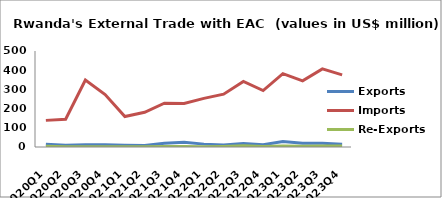
| Category | Exports | Imports | Re-Exports |
|---|---|---|---|
| 2020Q1 | 14.209 | 138.663 | 3.748 |
| 2020Q2 | 8.786 | 144.885 | 1.712 |
| 2020Q3 | 11.767 | 348.723 | 1.141 |
| 2020Q4 | 12.136 | 273.335 | 0.92 |
| 2021Q1 | 9.302 | 158.626 | 0.693 |
| 2021Q2 | 7.396 | 180.858 | 1.076 |
| 2021Q3 | 19.208 | 228.408 | 2.214 |
| 2021Q4 | 24.275 | 227.083 | 3.044 |
| 2022Q1 | 14.976 | 253.288 | 1.717 |
| 2022Q2 | 10.835 | 275.058 | 3.227 |
| 2022Q3 | 18.34 | 341.329 | 6.748 |
| 2022Q4 | 11.691 | 294.155 | 2.456 |
| 2023Q1 | 28.708 | 382.295 | 4.582 |
| 2023Q2 | 19.479 | 344.376 | 3.772 |
| 2023Q3 | 19.264 | 406.611 | 4.929 |
| 2023Q4 | 13.727 | 375.756 | 4.689 |